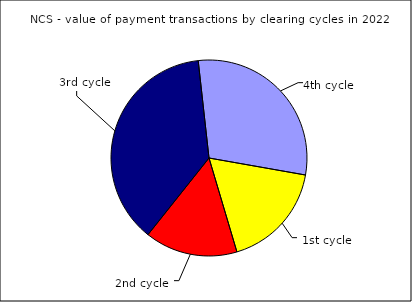
| Category | Series 0 |
|---|---|
| 1st cycle | 0.176 |
| 2nd cycle | 0.153 |
| 3rd cycle | 0.375 |
| 4th cycle | 0.295 |